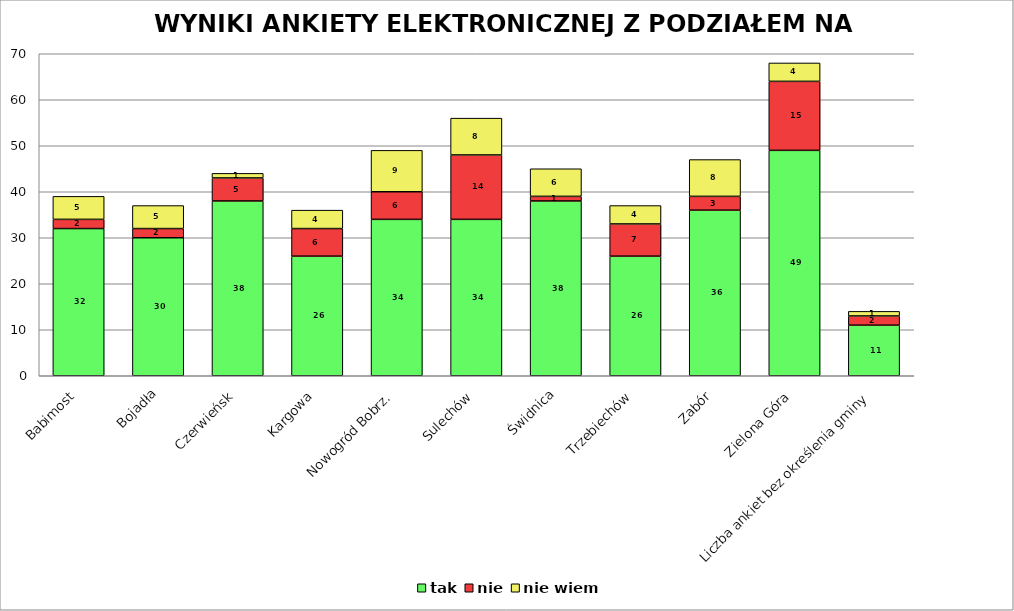
| Category | tak | nie | nie wiem |
|---|---|---|---|
| Babimost | 32 | 2 | 5 |
| Bojadła | 30 | 2 | 5 |
| Czerwieńsk | 38 | 5 | 1 |
| Kargowa | 26 | 6 | 4 |
| Nowogród Bobrz. | 34 | 6 | 9 |
| Sulechów | 34 | 14 | 8 |
| Świdnica | 38 | 1 | 6 |
| Trzebiechów | 26 | 7 | 4 |
| Zabór | 36 | 3 | 8 |
| Zielona Góra | 49 | 15 | 4 |
| Liczba ankiet bez określenia gminy | 11 | 2 | 1 |